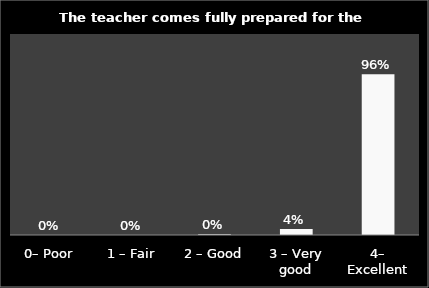
| Category | Series 0 |
|---|---|
| 0– Poor | 0 |
| 1 – Fair | 0 |
| 2 – Good | 0.004 |
| 3 – Very good | 0.037 |
| 4– Excellent | 0.96 |